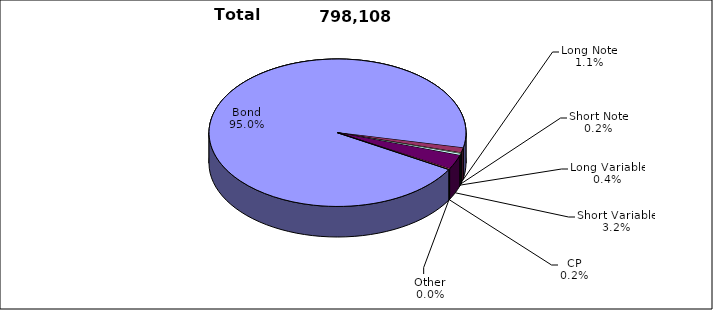
| Category | Trades |
|---|---|
| Bond | 757907 |
| Long Note | 8894 |
| Short Note | 1479 |
| Long Variable | 3035 |
| Short Variable | 25210 |
| CP | 1343 |
| Other | 240 |